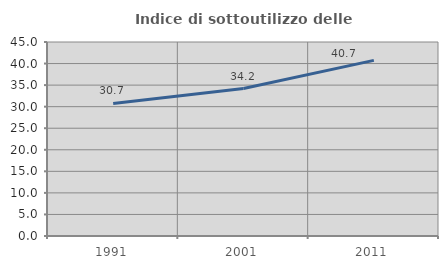
| Category | Indice di sottoutilizzo delle abitazioni  |
|---|---|
| 1991.0 | 30.739 |
| 2001.0 | 34.211 |
| 2011.0 | 40.741 |